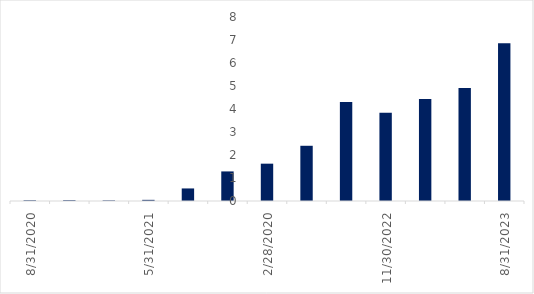
| Category | Series 0 |
|---|---|
| 8/31/20 | 0.031 |
| 11/30/20 | 0.035 |
| 2/28/21 | 0.026 |
| 5/31/21 | 0.05 |
| 8/31/21 | 0.546 |
| 11/30/21 | 1.286 |
| 2/28/20 | 1.623 |
| 5/31/22 | 2.401 |
| 8/31/22 | 4.305 |
| 11/30/22 | 3.839 |
| 2/28/23 | 4.432 |
| 5/31/23 | 4.911 |
| 8/31/23 | 6.854 |